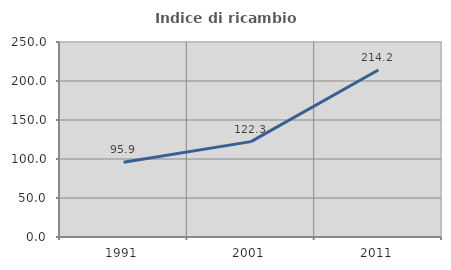
| Category | Indice di ricambio occupazionale  |
|---|---|
| 1991.0 | 95.859 |
| 2001.0 | 122.266 |
| 2011.0 | 214.178 |